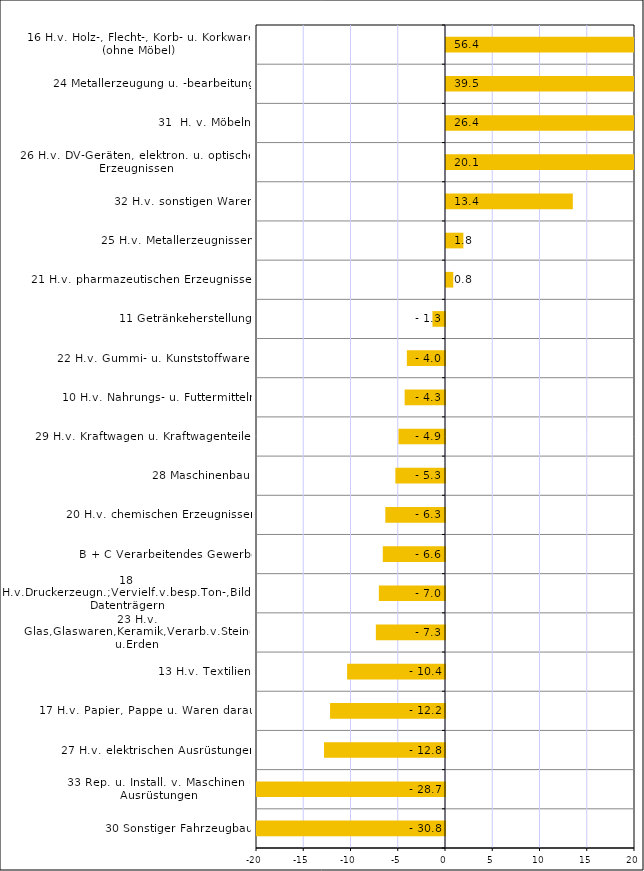
| Category | Series 0 |
|---|---|
| 30 Sonstiger Fahrzeugbau | -30.805 |
| 33 Rep. u. Install. v. Maschinen u. Ausrüstungen | -28.723 |
| 27 H.v. elektrischen Ausrüstungen | -12.801 |
| 17 H.v. Papier, Pappe u. Waren daraus | -12.164 |
| 13 H.v. Textilien | -10.358 |
| 23 H.v. Glas,Glaswaren,Keramik,Verarb.v.Steinen u.Erden | -7.316 |
| 18 H.v.Druckerzeugn.;Vervielf.v.besp.Ton-,Bild-u.Datenträgern | -7 |
| B + C Verarbeitendes Gewerbe | -6.582 |
| 20 H.v. chemischen Erzeugnissen | -6.317 |
| 28 Maschinenbau | -5.252 |
| 29 H.v. Kraftwagen u. Kraftwagenteilen | -4.921 |
| 10 H.v. Nahrungs- u. Futtermitteln | -4.27 |
| 22 H.v. Gummi- u. Kunststoffwaren | -4.037 |
| 11 Getränkeherstellung | -1.329 |
| 21 H.v. pharmazeutischen Erzeugnissen | 0.769 |
| 25 H.v. Metallerzeugnissen | 1.837 |
| 32 H.v. sonstigen Waren | 13.42 |
| 26 H.v. DV-Geräten, elektron. u. optischen Erzeugnissen | 20.081 |
| 31  H. v. Möbeln | 26.426 |
| 24 Metallerzeugung u. -bearbeitung | 39.529 |
| 16 H.v. Holz-, Flecht-, Korb- u. Korkwaren (ohne Möbel) | 56.425 |